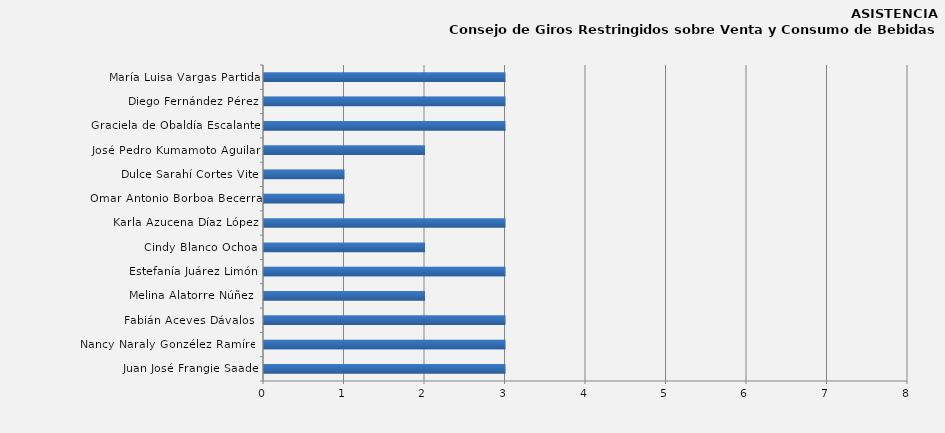
| Category | Series 0 |
|---|---|
| Juan José Frangie Saade | 3 |
| Nancy Naraly Gonzélez Ramírez | 3 |
| Fabián Aceves Dávalos  | 3 |
| Melina Alatorre Núñez  | 2 |
| Estefanía Juárez Limón | 3 |
| Cindy Blanco Ochoa | 2 |
| Karla Azucena Díaz López | 3 |
| Omar Antonio Borboa Becerra | 1 |
| Dulce Sarahí Cortes Vite | 1 |
| José Pedro Kumamoto Aguilar | 2 |
| Graciela de Obaldía Escalante | 3 |
| Diego Fernández Pérez | 3 |
| María Luisa Vargas Partida | 3 |